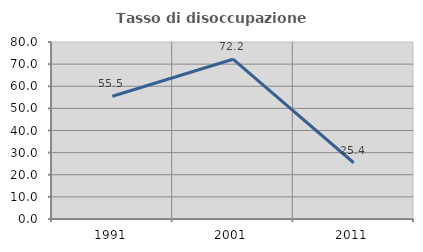
| Category | Tasso di disoccupazione giovanile  |
|---|---|
| 1991.0 | 55.474 |
| 2001.0 | 72.222 |
| 2011.0 | 25.424 |